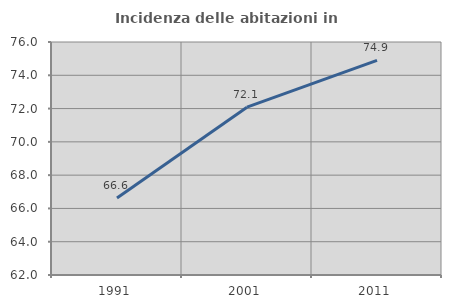
| Category | Incidenza delle abitazioni in proprietà  |
|---|---|
| 1991.0 | 66.63 |
| 2001.0 | 72.083 |
| 2011.0 | 74.895 |